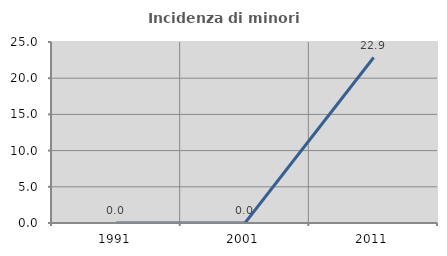
| Category | Incidenza di minori stranieri |
|---|---|
| 1991.0 | 0 |
| 2001.0 | 0 |
| 2011.0 | 22.857 |